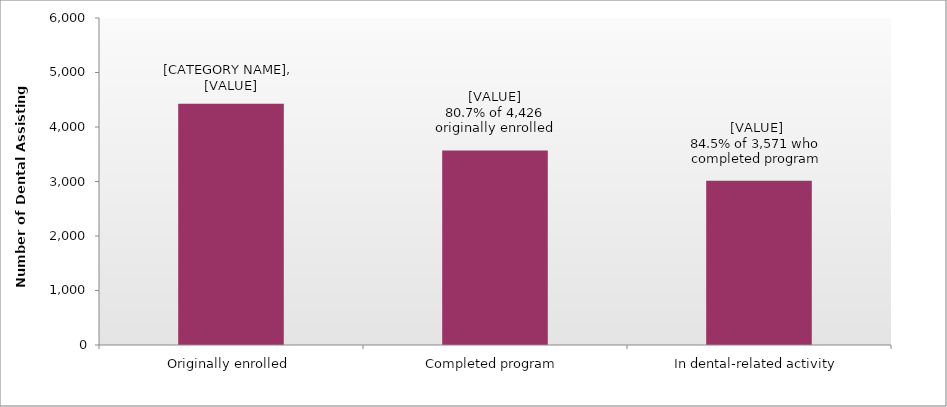
| Category | Series 0 |
|---|---|
| Originally enrolled | 4426 |
| Completed program | 3571 |
| In dental-related activity | 3016 |